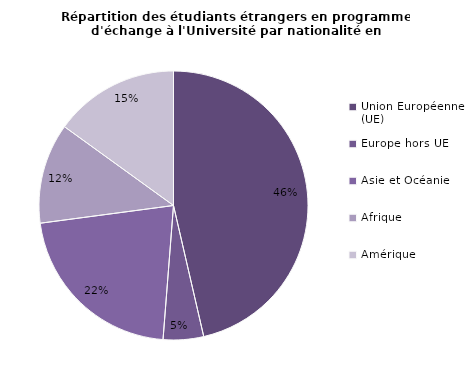
| Category | Nationalité |
|---|---|
| Union Européenne (UE) | 46.36 |
| Europe hors UE | 4.85 |
| Asie et Océanie | 21.64 |
| Afrique | 12.06 |
| Amérique | 15.03 |